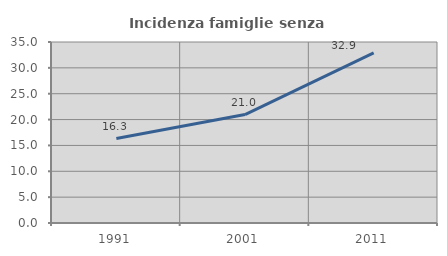
| Category | Incidenza famiglie senza nuclei |
|---|---|
| 1991.0 | 16.33 |
| 2001.0 | 20.97 |
| 2011.0 | 32.896 |